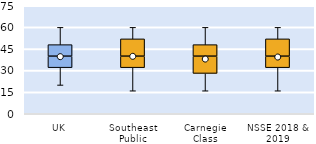
| Category | 25th | 50th | 75th |
|---|---|---|---|
| UK | 32 | 8 | 8 |
| Southeast Public | 32 | 8 | 12 |
| Carnegie Class | 28 | 12 | 8 |
| NSSE 2018 & 2019 | 32 | 8 | 12 |